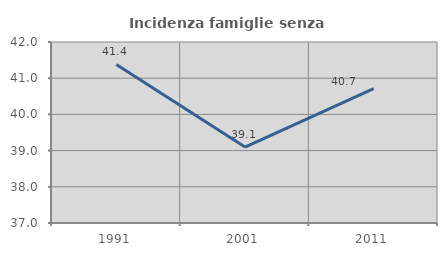
| Category | Incidenza famiglie senza nuclei |
|---|---|
| 1991.0 | 41.379 |
| 2001.0 | 39.098 |
| 2011.0 | 40.714 |